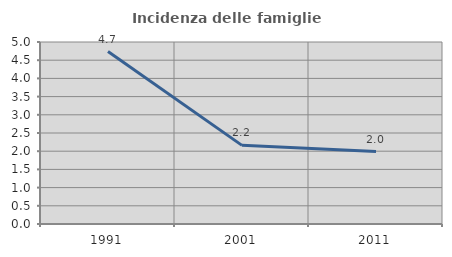
| Category | Incidenza delle famiglie numerose |
|---|---|
| 1991.0 | 4.738 |
| 2001.0 | 2.16 |
| 2011.0 | 1.989 |